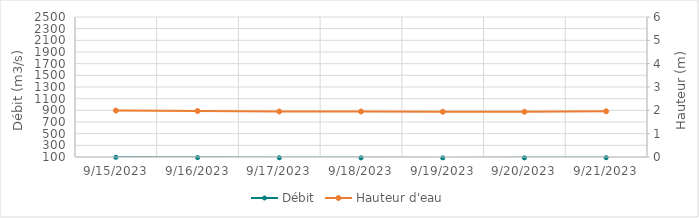
| Category | Débit |
|---|---|
| 5/11/23 | 707.71 |
| 5/10/23 | 675.19 |
| 5/9/23 | 721.38 |
| 5/8/23 | 709.96 |
| 5/7/23 | 610.29 |
| 5/6/23 | 593.21 |
| 5/5/23 | 570.43 |